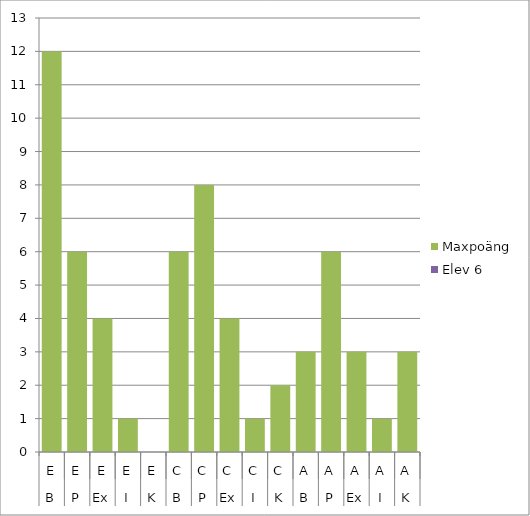
| Category | Maxpoäng | Elev 6 |
|---|---|---|
| 0 | 12 | 0 |
| 1 | 6 | 0 |
| 2 | 4 | 0 |
| 3 | 1 | 0 |
| 4 | 0 | 0 |
| 5 | 6 | 0 |
| 6 | 8 | 0 |
| 7 | 4 | 0 |
| 8 | 1 | 0 |
| 9 | 2 | 0 |
| 10 | 3 | 0 |
| 11 | 6 | 0 |
| 12 | 3 | 0 |
| 13 | 1 | 0 |
| 14 | 3 | 0 |